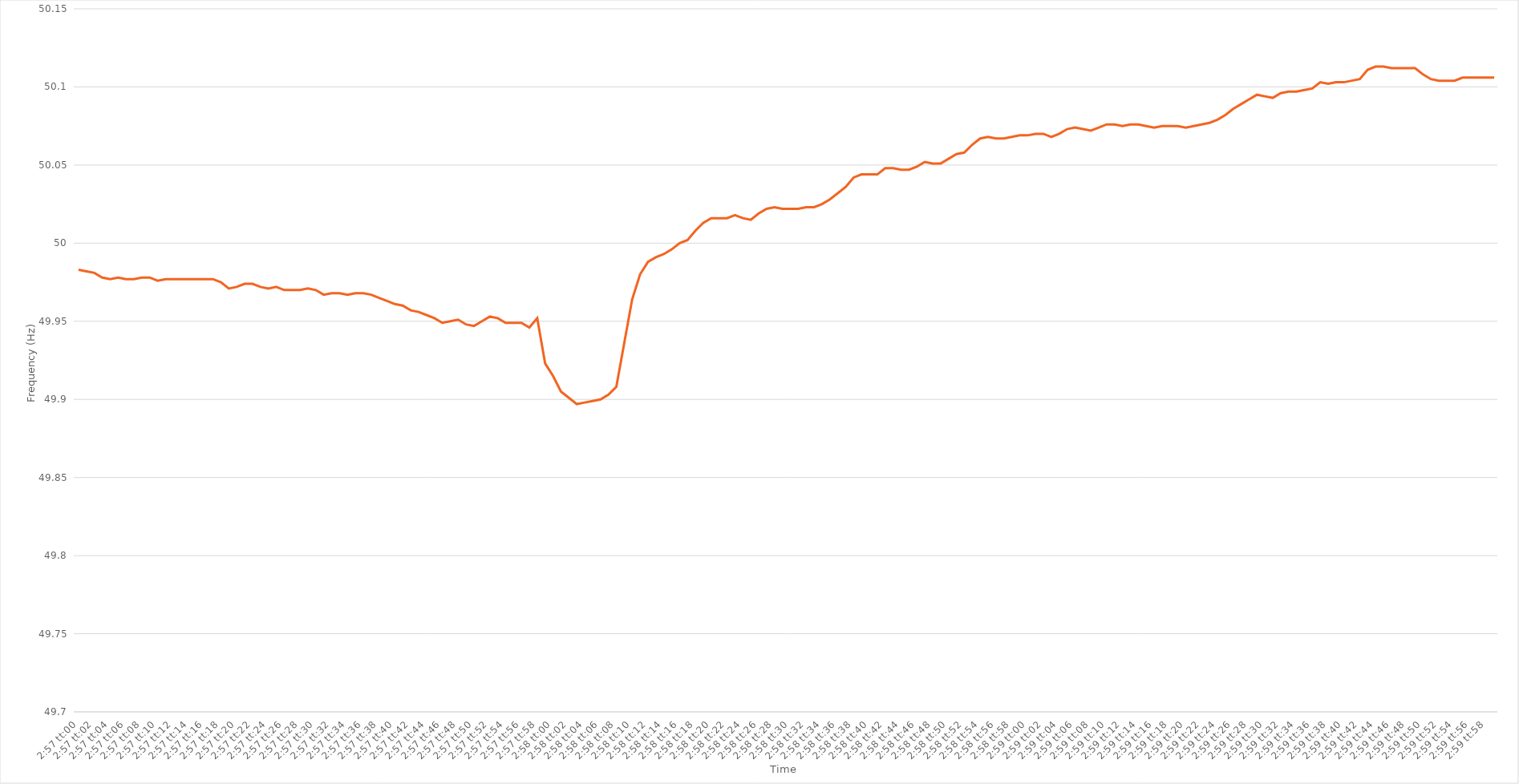
| Category | Series 0 |
|---|---|
| 0.12291666666666667 | 49.983 |
| 0.12292824074074075 | 49.982 |
| 0.12293981481481481 | 49.981 |
| 0.12295138888888889 | 49.978 |
| 0.12296296296296295 | 49.977 |
| 0.12297453703703703 | 49.978 |
| 0.12298611111111112 | 49.977 |
| 0.12299768518518518 | 49.977 |
| 0.12300925925925926 | 49.978 |
| 0.12302083333333334 | 49.978 |
| 0.1230324074074074 | 49.976 |
| 0.12304398148148148 | 49.977 |
| 0.12305555555555554 | 49.977 |
| 0.12306712962962962 | 49.977 |
| 0.1230787037037037 | 49.977 |
| 0.12309027777777777 | 49.977 |
| 0.12310185185185185 | 49.977 |
| 0.12311342592592593 | 49.977 |
| 0.123125 | 49.975 |
| 0.12313657407407408 | 49.971 |
| 0.12314814814814816 | 49.972 |
| 0.12315972222222223 | 49.974 |
| 0.1231712962962963 | 49.974 |
| 0.12318287037037036 | 49.972 |
| 0.12319444444444444 | 49.971 |
| 0.12320601851851852 | 49.972 |
| 0.12321759259259259 | 49.97 |
| 0.12322916666666667 | 49.97 |
| 0.12324074074074075 | 49.97 |
| 0.12325231481481481 | 49.971 |
| 0.1232638888888889 | 49.97 |
| 0.12327546296296295 | 49.967 |
| 0.12328703703703703 | 49.968 |
| 0.12329861111111111 | 49.968 |
| 0.12331018518518518 | 49.967 |
| 0.12332175925925926 | 49.968 |
| 0.12333333333333334 | 49.968 |
| 0.1233449074074074 | 49.967 |
| 0.12335648148148148 | 49.965 |
| 0.12336805555555556 | 49.963 |
| 0.12337962962962963 | 49.961 |
| 0.12339120370370371 | 49.96 |
| 0.12340277777777779 | 49.957 |
| 0.12341435185185186 | 49.956 |
| 0.12342592592592593 | 49.954 |
| 0.12343749999999999 | 49.952 |
| 0.12344907407407407 | 49.949 |
| 0.12346064814814815 | 49.95 |
| 0.12347222222222222 | 49.951 |
| 0.1234837962962963 | 49.948 |
| 0.12349537037037038 | 49.947 |
| 0.12350694444444445 | 49.95 |
| 0.12351851851851851 | 49.953 |
| 0.12353009259259258 | 49.952 |
| 0.12354166666666666 | 49.949 |
| 0.12355324074074074 | 49.949 |
| 0.12356481481481481 | 49.949 |
| 0.12357638888888889 | 49.946 |
| 0.12358796296296297 | 49.952 |
| 0.12359953703703704 | 49.923 |
| 0.12361111111111112 | 49.915 |
| 0.1236226851851852 | 49.905 |
| 0.12363425925925926 | 49.901 |
| 0.12364583333333333 | 49.897 |
| 0.12365740740740742 | 49.898 |
| 0.12366898148148148 | 49.899 |
| 0.12368055555555556 | 49.9 |
| 0.12369212962962962 | 49.903 |
| 0.1237037037037037 | 49.908 |
| 0.12371527777777779 | 49.936 |
| 0.12372685185185185 | 49.964 |
| 0.12373842592592592 | 49.98 |
| 0.12375000000000001 | 49.988 |
| 0.12376157407407407 | 49.991 |
| 0.12377314814814815 | 49.993 |
| 0.12378472222222221 | 49.996 |
| 0.1237962962962963 | 50 |
| 0.12380787037037037 | 50.002 |
| 0.12381944444444444 | 50.008 |
| 0.12383101851851852 | 50.013 |
| 0.1238425925925926 | 50.016 |
| 0.12385416666666667 | 50.016 |
| 0.12386574074074075 | 50.016 |
| 0.12387731481481483 | 50.018 |
| 0.12388888888888888 | 50.016 |
| 0.12390046296296296 | 50.015 |
| 0.12391203703703703 | 50.019 |
| 0.12392361111111111 | 50.022 |
| 0.12393518518518519 | 50.023 |
| 0.12394675925925926 | 50.022 |
| 0.12395833333333334 | 50.022 |
| 0.12396990740740742 | 50.022 |
| 0.12398148148148147 | 50.023 |
| 0.12399305555555555 | 50.023 |
| 0.12400462962962962 | 50.025 |
| 0.1240162037037037 | 50.028 |
| 0.12402777777777778 | 50.032 |
| 0.12403935185185185 | 50.036 |
| 0.12405092592592593 | 50.042 |
| 0.1240625 | 50.044 |
| 0.12407407407407407 | 50.044 |
| 0.12408564814814815 | 50.044 |
| 0.12409722222222223 | 50.048 |
| 0.1241087962962963 | 50.048 |
| 0.12412037037037038 | 50.047 |
| 0.12413194444444443 | 50.047 |
| 0.12414351851851851 | 50.049 |
| 0.1241550925925926 | 50.052 |
| 0.12416666666666666 | 50.051 |
| 0.12417824074074074 | 50.051 |
| 0.12418981481481482 | 50.054 |
| 0.12420138888888889 | 50.057 |
| 0.12421296296296297 | 50.058 |
| 0.12422453703703702 | 50.063 |
| 0.1242361111111111 | 50.067 |
| 0.12424768518518518 | 50.068 |
| 0.12425925925925925 | 50.067 |
| 0.12427083333333333 | 50.067 |
| 0.12428240740740741 | 50.068 |
| 0.12429398148148148 | 50.069 |
| 0.12430555555555556 | 50.069 |
| 0.12431712962962964 | 50.07 |
| 0.1243287037037037 | 50.07 |
| 0.12434027777777779 | 50.068 |
| 0.12435185185185187 | 50.07 |
| 0.12436342592592593 | 50.073 |
| 0.124375 | 50.074 |
| 0.12438657407407407 | 50.073 |
| 0.12439814814814815 | 50.072 |
| 0.12440972222222223 | 50.074 |
| 0.1244212962962963 | 50.076 |
| 0.12443287037037037 | 50.076 |
| 0.12444444444444445 | 50.075 |
| 0.12445601851851852 | 50.076 |
| 0.12446759259259259 | 50.076 |
| 0.12447916666666665 | 50.075 |
| 0.12449074074074074 | 50.074 |
| 0.12450231481481482 | 50.075 |
| 0.12451388888888888 | 50.075 |
| 0.12452546296296296 | 50.075 |
| 0.12453703703703704 | 50.074 |
| 0.12454861111111111 | 50.075 |
| 0.12456018518518519 | 50.076 |
| 0.12457175925925927 | 50.077 |
| 0.12458333333333334 | 50.079 |
| 0.1245949074074074 | 50.082 |
| 0.12460648148148147 | 50.086 |
| 0.12461805555555555 | 50.089 |
| 0.12462962962962963 | 50.092 |
| 0.1246412037037037 | 50.095 |
| 0.12465277777777778 | 50.094 |
| 0.12466435185185186 | 50.093 |
| 0.12467592592592593 | 50.096 |
| 0.12468749999999999 | 50.097 |
| 0.12469907407407409 | 50.097 |
| 0.12471064814814814 | 50.098 |
| 0.12472222222222222 | 50.099 |
| 0.12473379629629629 | 50.103 |
| 0.12474537037037037 | 50.102 |
| 0.12475694444444445 | 50.103 |
| 0.12476851851851851 | 50.103 |
| 0.1247800925925926 | 50.104 |
| 0.12479166666666668 | 50.105 |
| 0.12480324074074074 | 50.111 |
| 0.12481481481481482 | 50.113 |
| 0.1248263888888889 | 50.113 |
| 0.12483796296296296 | 50.112 |
| 0.12484953703703704 | 50.112 |
| 0.1248611111111111 | 50.112 |
| 0.12487268518518518 | 50.112 |
| 0.12488425925925926 | 50.108 |
| 0.12489583333333333 | 50.105 |
| 0.12490740740740741 | 50.104 |
| 0.12491898148148149 | 50.104 |
| 0.12493055555555554 | 50.104 |
| 0.12494212962962963 | 50.106 |
| 0.12495370370370369 | 50.106 |
| 0.12496527777777777 | 50.106 |
| 0.12497685185185185 | 50.106 |
| 0.12498842592592592 | 50.106 |